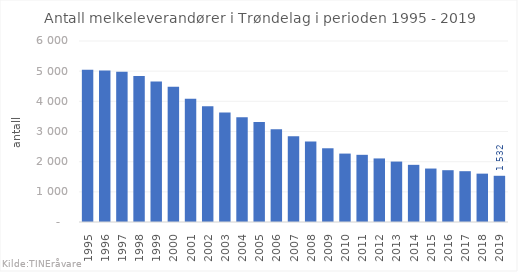
| Category | Totalt |
|---|---|
| 1995 | 5051 |
| 1996 | 5018 |
| 1997 | 4981 |
| 1998 | 4842 |
| 1999 | 4654 |
| 2000 | 4484 |
| 2001 | 4087 |
| 2002 | 3841 |
| 2003 | 3628 |
| 2004 | 3470 |
| 2005 | 3318 |
| 2006 | 3078 |
| 2007 | 2839 |
| 2008 | 2667 |
| 2009 | 2444 |
| 2010 | 2268 |
| 2011 | 2227 |
| 2012 | 2107 |
| 2013 | 2003 |
| 2014 | 1895 |
| 2015 | 1772 |
| 2016 | 1717 |
| 2017 | 1684 |
| 2018 | 1603 |
| 2019 | 1532 |